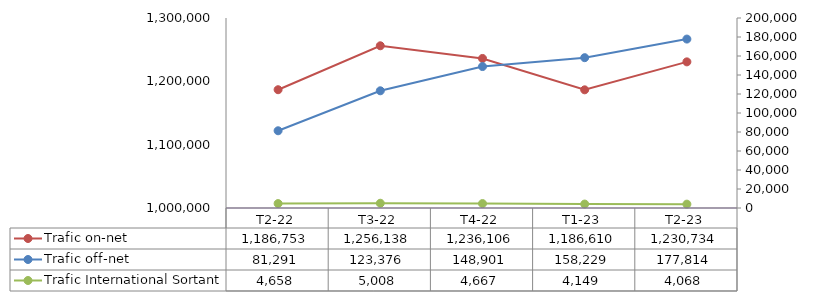
| Category | Trafic on-net |
|---|---|
| T2-22 | 1186752.513 |
| T3-22 | 1256137.727 |
| T4-22 | 1236106.01 |
| T1-23 | 1186609.846 |
| T2-23 | 1230733.904 |